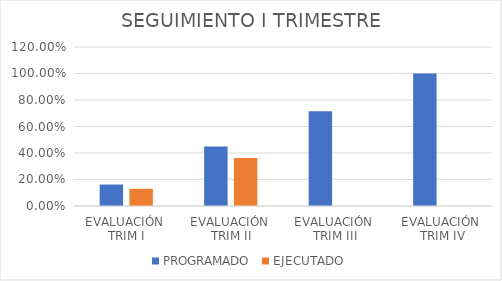
| Category | PROGRAMADO | EJECUTADO |
|---|---|---|
| EVALUACIÓN 
TRIM I | 0.162 | 0.13 |
| EVALUACIÓN 
TRIM II | 0.448 | 0.362 |
| EVALUACIÓN 
TRIM III | 0.715 | 0 |
| EVALUACIÓN
 TRIM IV | 1 | 0 |